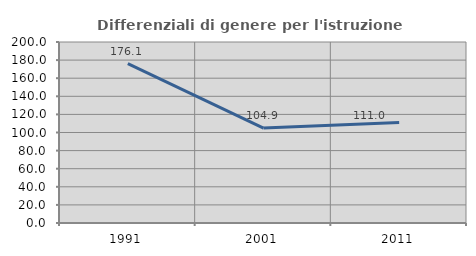
| Category | Differenziali di genere per l'istruzione superiore |
|---|---|
| 1991.0 | 176.12 |
| 2001.0 | 104.931 |
| 2011.0 | 111.005 |